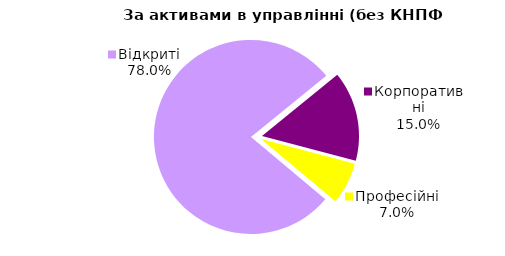
| Category | Series 0 |
|---|---|
| Відкриті | 1838.666 |
| Корпоративні | 352.735 |
| Професійні | 165.197 |